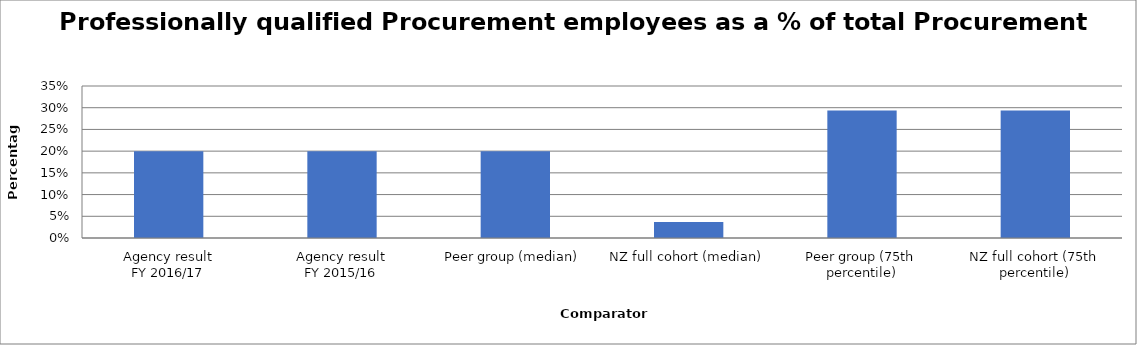
| Category | Series 0 |
|---|---|
| Agency result
FY 2016/17 | 0.2 |
| Agency result
FY 2015/16 | 0.2 |
| Peer group (median) | 0.2 |
| NZ full cohort (median) | 0.037 |
| Peer group (75th percentile) | 0.293 |
| NZ full cohort (75th percentile) | 0.293 |